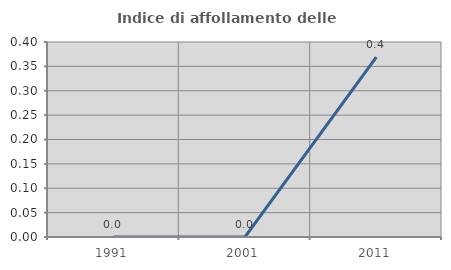
| Category | Indice di affollamento delle abitazioni  |
|---|---|
| 1991.0 | 0 |
| 2001.0 | 0 |
| 2011.0 | 0.369 |